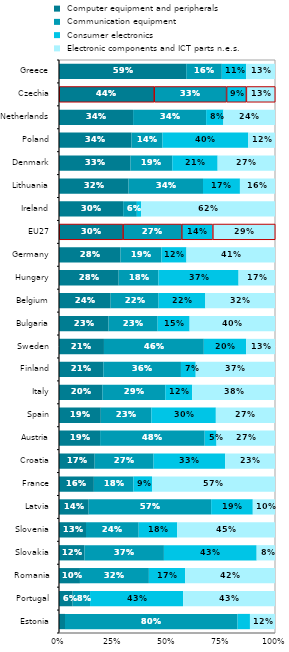
| Category |  Computer equipment and peripherals |  Communication equipment |  Consumer electronics |  Electronic components and ICT parts n.e.s. |
|---|---|---|---|---|
| Estonia | 0.028 | 0.799 | 0.057 | 0.116 |
| Portugal | 0.063 | 0.081 | 0.431 | 0.425 |
| Romania | 0.097 | 0.319 | 0.168 | 0.416 |
| Slovakia | 0.118 | 0.368 | 0.429 | 0.085 |
| Slovenia | 0.125 | 0.244 | 0.178 | 0.453 |
| Latvia | 0.137 | 0.567 | 0.193 | 0.103 |
| France | 0.161 | 0.183 | 0.086 | 0.569 |
| Croatia | 0.165 | 0.273 | 0.331 | 0.231 |
| Austria | 0.19 | 0.484 | 0.055 | 0.271 |
| Spain | 0.194 | 0.234 | 0.298 | 0.274 |
| Italy | 0.201 | 0.291 | 0.125 | 0.383 |
| Finland | 0.205 | 0.359 | 0.068 | 0.367 |
| Sweden | 0.208 | 0.462 | 0.196 | 0.134 |
| Bulgaria | 0.229 | 0.227 | 0.148 | 0.395 |
| Belgium | 0.239 | 0.222 | 0.216 | 0.323 |
| Hungary | 0.276 | 0.184 | 0.371 | 0.169 |
| Germany | 0.285 | 0.19 | 0.116 | 0.41 |
| EU27 | 0.295 | 0.272 | 0.144 | 0.289 |
| Ireland | 0.297 | 0.063 | 0.02 | 0.62 |
| Lithuania | 0.322 | 0.345 | 0.171 | 0.162 |
| Denmark | 0.331 | 0.194 | 0.21 | 0.266 |
| Poland | 0.336 | 0.143 | 0.397 | 0.124 |
| Netherlands | 0.343 | 0.338 | 0.08 | 0.239 |
| Czechia | 0.44 | 0.335 | 0.092 | 0.134 |
| Greece | 0.589 | 0.165 | 0.113 | 0.133 |